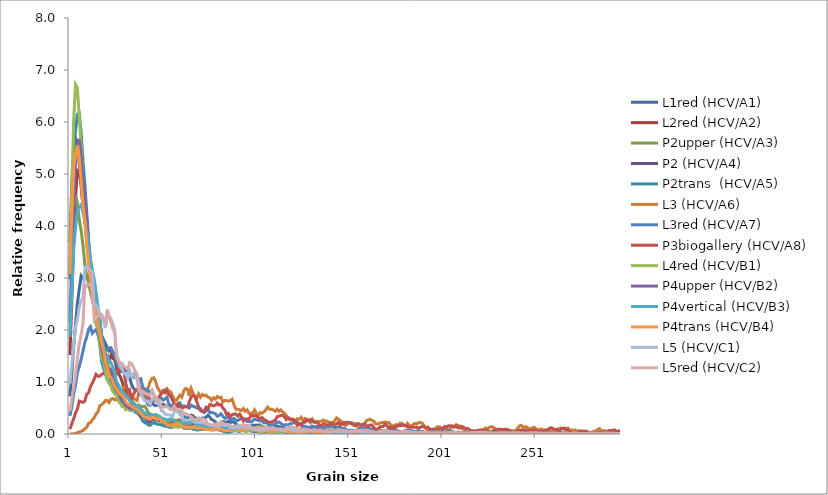
| Category | L1red (HCV/A1)  | L2red (HCV/A2)  | P2upper (HCV/A3) | P2 (HCV/A4) | P2trans  (HCV/A5) | L3 (HCV/A6) | L3red (HCV/A7) | P3biogallery (HCV/A8) | L4red (HCV/B1) | P4upper (HCV/B2) | P4vertical (HCV/B3) | P4trans (HCV/B4) | L5 (HCV/C1) | L5red (HCV/C2) |
|---|---|---|---|---|---|---|---|---|---|---|---|---|---|---|
| 0 | 0.723 | 1.518 | 3.161 | 3.675 | 2.975 | 0 | 0.349 | 0.092 | 3.28 | 2.144 | 1.867 | 3.077 | 0.969 | 0.437 |
| 1 | 1.149 | 2.56 | 3.905 | 4.815 | 4.295 | 0 | 0.524 | 0.198 | 4.693 | 3.442 | 2.732 | 4.204 | 1.339 | 0.682 |
| 2 | 1.673 | 3.662 | 4.352 | 5.426 | 5.286 | 0 | 0.77 | 0.29 | 6.027 | 4.434 | 3.531 | 5.092 | 1.691 | 0.905 |
| 3 | 2.107 | 4.538 | 4.59 | 5.691 | 5.826 | 0.013 | 0.936 | 0.409 | 6.72 | 5.186 | 3.966 | 5.383 | 2.053 | 1.142 |
| 4 | 2.509 | 5.067 | 4.416 | 5.624 | 6.153 | 0.026 | 1.182 | 0.475 | 6.652 | 5.572 | 4.315 | 5.553 | 2.214 | 1.448 |
| 5 | 2.785 | 5.041 | 4.12 | 5.19 | 6.171 | 0.039 | 1.293 | 0.634 | 6.099 | 5.671 | 4.366 | 5.298 | 2.441 | 1.725 |
| 6 | 3.041 | 4.807 | 3.916 | 4.786 | 5.804 | 0.052 | 1.436 | 0.62 | 5.521 | 5.288 | 4.408 | 4.871 | 2.563 | 1.906 |
| 7 | 2.996 | 4.36 | 3.626 | 4.399 | 5.264 | 0.064 | 1.595 | 0.607 | 4.833 | 4.902 | 4.257 | 4.388 | 2.605 | 2.118 |
| 8 | 3.021 | 4.143 | 3.26 | 4.102 | 4.803 | 0.103 | 1.761 | 0.634 | 4.228 | 4.533 | 4.098 | 4.101 | 3.16 | 2.863 |
| 9 | 3.045 | 3.761 | 3.051 | 3.719 | 4.27 | 0.129 | 1.864 | 0.766 | 3.682 | 4.146 | 3.9 | 3.629 | 3.233 | 2.839 |
| 10 | 3.029 | 3.523 | 2.899 | 3.347 | 3.722 | 0.206 | 2.015 | 0.792 | 3.304 | 3.709 | 3.686 | 3.283 | 3.188 | 2.873 |
| 11 | 2.826 | 3.271 | 2.737 | 3.049 | 3.174 | 0.219 | 2.063 | 0.911 | 3.014 | 3.36 | 3.333 | 2.973 | 3.154 | 2.873 |
| 12 | 2.834 | 3.106 | 2.58 | 2.759 | 2.942 | 0.27 | 1.936 | 0.977 | 2.731 | 3.11 | 3.166 | 2.697 | 3.123 | 2.79 |
| 13 | 2.696 | 2.807 | 2.446 | 2.472 | 2.536 | 0.309 | 1.975 | 1.056 | 2.373 | 2.73 | 2.976 | 2.428 | 2.495 | 2.199 |
| 14 | 2.542 | 2.581 | 2.173 | 2.266 | 2.264 | 0.386 | 2.007 | 1.149 | 2.106 | 2.405 | 2.728 | 2.358 | 2.49 | 2.248 |
| 15 | 2.322 | 2.343 | 2.034 | 2.078 | 1.923 | 0.425 | 1.912 | 1.109 | 2.034 | 2.144 | 2.449 | 2.108 | 2.409 | 2.264 |
| 16 | 2.201 | 2.169 | 1.842 | 1.883 | 1.72 | 0.541 | 1.888 | 1.109 | 1.744 | 1.907 | 2.227 | 1.968 | 2.308 | 2.285 |
| 17 | 1.896 | 1.861 | 1.807 | 1.641 | 1.397 | 0.567 | 1.848 | 1.149 | 1.469 | 1.653 | 1.816 | 1.743 | 2.222 | 2.298 |
| 18 | 1.815 | 1.709 | 1.621 | 1.53 | 1.266 | 0.592 | 1.722 | 1.162 | 1.385 | 1.477 | 1.672 | 1.618 | 2.18 | 2.22 |
| 19 | 1.738 | 1.514 | 1.54 | 1.398 | 1.154 | 0.644 | 1.595 | 1.175 | 1.218 | 1.355 | 1.513 | 1.385 | 2.037 | 2.144 |
| 20 | 1.669 | 1.51 | 1.371 | 1.254 | 1.045 | 0.644 | 1.626 | 1.254 | 1.039 | 1.247 | 1.517 | 1.286 | 2.279 | 2.392 |
| 21 | 1.6 | 1.414 | 1.232 | 1.118 | 1.038 | 0.605 | 1.65 | 1.267 | 0.971 | 1.186 | 1.37 | 1.124 | 2.269 | 2.254 |
| 22 | 1.64 | 1.514 | 1.063 | 1.104 | 1.019 | 0.67 | 1.658 | 1.215 | 0.916 | 1.22 | 1.378 | 1.087 | 2.214 | 2.152 |
| 23 | 1.531 | 1.453 | 0.906 | 0.986 | 0.929 | 0.683 | 1.579 | 1.215 | 0.82 | 1.121 | 1.273 | 0.999 | 2.12 | 2.024 |
| 24 | 1.413 | 1.462 | 0.837 | 0.905 | 0.838 | 0.657 | 1.515 | 1.096 | 0.772 | 1.06 | 1.18 | 0.914 | 1.995 | 1.948 |
| 25 | 1.368 | 1.241 | 0.877 | 0.831 | 0.78 | 0.657 | 1.388 | 1.175 | 0.732 | 0.942 | 1.001 | 0.862 | 1.534 | 1.472 |
| 26 | 1.267 | 1.163 | 0.86 | 0.769 | 0.653 | 0.773 | 1.285 | 1.241 | 0.637 | 0.81 | 0.947 | 0.807 | 1.417 | 1.404 |
| 27 | 1.198 | 1.102 | 0.773 | 0.662 | 0.664 | 0.786 | 1.301 | 1.228 | 0.585 | 0.701 | 0.873 | 0.759 | 1.292 | 1.37 |
| 28 | 1.202 | 1.007 | 0.813 | 0.644 | 0.624 | 0.824 | 1.261 | 1.254 | 0.525 | 0.654 | 0.803 | 0.737 | 1.248 | 1.357 |
| 29 | 1.194 | 0.863 | 0.796 | 0.585 | 0.591 | 0.901 | 1.269 | 1.188 | 0.529 | 0.606 | 0.764 | 0.7 | 1.162 | 1.299 |
| 30 | 1.121 | 0.82 | 0.732 | 0.555 | 0.57 | 0.94 | 1.222 | 0.964 | 0.466 | 0.539 | 0.737 | 0.612 | 1.151 | 1.281 |
| 31 | 1.133 | 0.759 | 0.709 | 0.555 | 0.537 | 0.85 | 1.222 | 0.805 | 0.494 | 0.532 | 0.687 | 0.578 | 1.076 | 1.242 |
| 32 | 1.104 | 0.651 | 0.674 | 0.544 | 0.461 | 0.747 | 1.158 | 0.845 | 0.462 | 0.495 | 0.652 | 0.553 | 1.227 | 1.373 |
| 33 | 0.954 | 0.599 | 0.645 | 0.489 | 0.45 | 0.734 | 1.127 | 0.673 | 0.474 | 0.484 | 0.613 | 0.531 | 1.115 | 1.357 |
| 34 | 0.885 | 0.573 | 0.61 | 0.489 | 0.468 | 0.683 | 1.095 | 0.752 | 0.458 | 0.488 | 0.582 | 0.505 | 1.149 | 1.286 |
| 35 | 0.836 | 0.564 | 0.552 | 0.456 | 0.421 | 0.67 | 1.182 | 0.832 | 0.47 | 0.484 | 0.536 | 0.497 | 1.097 | 1.208 |
| 36 | 0.853 | 0.486 | 0.511 | 0.412 | 0.406 | 0.644 | 1.103 | 0.858 | 0.438 | 0.457 | 0.524 | 0.475 | 1.039 | 1.15 |
| 37 | 0.857 | 0.46 | 0.558 | 0.375 | 0.403 | 0.798 | 1.047 | 0.792 | 0.422 | 0.444 | 0.528 | 0.45 | 0.823 | 0.912 |
| 38 | 0.853 | 0.43 | 0.529 | 0.327 | 0.374 | 0.76 | 1.063 | 0.871 | 0.378 | 0.393 | 0.489 | 0.405 | 0.794 | 0.831 |
| 39 | 0.739 | 0.416 | 0.529 | 0.257 | 0.261 | 0.734 | 0.904 | 0.792 | 0.338 | 0.325 | 0.438 | 0.357 | 0.706 | 0.803 |
| 40 | 0.743 | 0.382 | 0.535 | 0.261 | 0.221 | 0.708 | 0.865 | 0.752 | 0.299 | 0.322 | 0.407 | 0.328 | 0.643 | 0.784 |
| 41 | 0.641 | 0.377 | 0.488 | 0.239 | 0.207 | 0.85 | 0.857 | 0.766 | 0.291 | 0.274 | 0.384 | 0.31 | 0.636 | 0.766 |
| 42 | 0.564 | 0.36 | 0.413 | 0.224 | 0.174 | 0.889 | 0.841 | 0.713 | 0.287 | 0.271 | 0.357 | 0.31 | 0.61 | 0.748 |
| 43 | 0.548 | 0.36 | 0.383 | 0.239 | 0.167 | 1.005 | 0.777 | 0.66 | 0.311 | 0.278 | 0.349 | 0.284 | 0.568 | 0.745 |
| 44 | 0.601 | 0.351 | 0.36 | 0.283 | 0.203 | 1.069 | 0.833 | 0.673 | 0.318 | 0.308 | 0.373 | 0.317 | 0.682 | 0.824 |
| 45 | 0.56 | 0.343 | 0.314 | 0.272 | 0.218 | 1.082 | 0.754 | 0.634 | 0.295 | 0.281 | 0.361 | 0.317 | 0.675 | 0.763 |
| 46 | 0.544 | 0.351 | 0.343 | 0.257 | 0.2 | 1.005 | 0.674 | 0.647 | 0.275 | 0.301 | 0.376 | 0.306 | 0.651 | 0.701 |
| 47 | 0.56 | 0.343 | 0.331 | 0.261 | 0.189 | 0.889 | 0.595 | 0.686 | 0.263 | 0.291 | 0.357 | 0.287 | 0.583 | 0.677 |
| 48 | 0.552 | 0.321 | 0.337 | 0.239 | 0.181 | 0.837 | 0.706 | 0.726 | 0.231 | 0.257 | 0.341 | 0.298 | 0.586 | 0.635 |
| 49 | 0.568 | 0.295 | 0.279 | 0.202 | 0.174 | 0.773 | 0.69 | 0.779 | 0.227 | 0.257 | 0.307 | 0.262 | 0.445 | 0.515 |
| 50 | 0.572 | 0.295 | 0.273 | 0.18 | 0.163 | 0.824 | 0.651 | 0.832 | 0.231 | 0.247 | 0.295 | 0.239 | 0.438 | 0.512 |
| 51 | 0.544 | 0.26 | 0.256 | 0.18 | 0.145 | 0.85 | 0.674 | 0.792 | 0.199 | 0.2 | 0.279 | 0.221 | 0.383 | 0.528 |
| 52 | 0.532 | 0.239 | 0.256 | 0.18 | 0.156 | 0.876 | 0.706 | 0.832 | 0.187 | 0.183 | 0.276 | 0.181 | 0.375 | 0.523 |
| 53 | 0.532 | 0.243 | 0.232 | 0.166 | 0.134 | 0.824 | 0.587 | 0.752 | 0.187 | 0.183 | 0.276 | 0.169 | 0.367 | 0.507 |
| 54 | 0.512 | 0.239 | 0.256 | 0.184 | 0.123 | 0.811 | 0.532 | 0.726 | 0.151 | 0.166 | 0.291 | 0.173 | 0.365 | 0.465 |
| 55 | 0.483 | 0.217 | 0.279 | 0.177 | 0.131 | 0.734 | 0.555 | 0.647 | 0.147 | 0.18 | 0.283 | 0.188 | 0.336 | 0.484 |
| 56 | 0.483 | 0.23 | 0.267 | 0.166 | 0.16 | 0.657 | 0.547 | 0.581 | 0.135 | 0.183 | 0.248 | 0.177 | 0.432 | 0.536 |
| 57 | 0.52 | 0.239 | 0.25 | 0.18 | 0.163 | 0.644 | 0.563 | 0.528 | 0.143 | 0.21 | 0.21 | 0.206 | 0.438 | 0.476 |
| 58 | 0.475 | 0.247 | 0.273 | 0.191 | 0.171 | 0.695 | 0.555 | 0.581 | 0.123 | 0.207 | 0.21 | 0.192 | 0.422 | 0.471 |
| 59 | 0.382 | 0.243 | 0.273 | 0.158 | 0.174 | 0.747 | 0.595 | 0.515 | 0.159 | 0.176 | 0.221 | 0.181 | 0.38 | 0.473 |
| 60 | 0.349 | 0.221 | 0.227 | 0.14 | 0.145 | 0.708 | 0.524 | 0.488 | 0.155 | 0.156 | 0.206 | 0.147 | 0.352 | 0.455 |
| 61 | 0.357 | 0.226 | 0.209 | 0.151 | 0.116 | 0.824 | 0.539 | 0.515 | 0.155 | 0.156 | 0.202 | 0.144 | 0.263 | 0.376 |
| 62 | 0.3 | 0.23 | 0.215 | 0.11 | 0.105 | 0.876 | 0.532 | 0.528 | 0.135 | 0.132 | 0.217 | 0.118 | 0.274 | 0.4 |
| 63 | 0.305 | 0.182 | 0.174 | 0.118 | 0.123 | 0.863 | 0.524 | 0.515 | 0.151 | 0.136 | 0.233 | 0.133 | 0.266 | 0.371 |
| 64 | 0.341 | 0.178 | 0.186 | 0.125 | 0.105 | 0.734 | 0.5 | 0.62 | 0.119 | 0.149 | 0.221 | 0.125 | 0.274 | 0.363 |
| 65 | 0.365 | 0.2 | 0.209 | 0.121 | 0.109 | 0.876 | 0.555 | 0.713 | 0.123 | 0.156 | 0.217 | 0.129 | 0.284 | 0.335 |
| 66 | 0.349 | 0.182 | 0.232 | 0.096 | 0.112 | 0.786 | 0.532 | 0.739 | 0.123 | 0.156 | 0.233 | 0.14 | 0.258 | 0.293 |
| 67 | 0.309 | 0.161 | 0.238 | 0.107 | 0.094 | 0.721 | 0.524 | 0.726 | 0.135 | 0.156 | 0.217 | 0.136 | 0.237 | 0.269 |
| 68 | 0.3 | 0.169 | 0.227 | 0.096 | 0.076 | 0.683 | 0.5 | 0.62 | 0.127 | 0.166 | 0.167 | 0.111 | 0.221 | 0.277 |
| 69 | 0.288 | 0.174 | 0.227 | 0.085 | 0.08 | 0.773 | 0.484 | 0.528 | 0.131 | 0.169 | 0.155 | 0.114 | 0.229 | 0.311 |
| 70 | 0.276 | 0.169 | 0.192 | 0.085 | 0.102 | 0.708 | 0.484 | 0.449 | 0.111 | 0.186 | 0.163 | 0.122 | 0.214 | 0.282 |
| 71 | 0.309 | 0.156 | 0.163 | 0.088 | 0.098 | 0.76 | 0.436 | 0.436 | 0.119 | 0.173 | 0.14 | 0.099 | 0.221 | 0.293 |
| 72 | 0.309 | 0.169 | 0.139 | 0.092 | 0.116 | 0.734 | 0.413 | 0.436 | 0.096 | 0.152 | 0.14 | 0.099 | 0.198 | 0.282 |
| 73 | 0.321 | 0.169 | 0.151 | 0.092 | 0.116 | 0.747 | 0.444 | 0.515 | 0.104 | 0.125 | 0.144 | 0.085 | 0.201 | 0.254 |
| 74 | 0.361 | 0.178 | 0.122 | 0.099 | 0.116 | 0.708 | 0.484 | 0.488 | 0.1 | 0.119 | 0.12 | 0.092 | 0.18 | 0.193 |
| 75 | 0.329 | 0.169 | 0.128 | 0.11 | 0.112 | 0.695 | 0.413 | 0.568 | 0.104 | 0.085 | 0.12 | 0.081 | 0.172 | 0.186 |
| 76 | 0.276 | 0.161 | 0.105 | 0.118 | 0.112 | 0.644 | 0.413 | 0.554 | 0.104 | 0.081 | 0.12 | 0.085 | 0.156 | 0.167 |
| 77 | 0.264 | 0.139 | 0.116 | 0.103 | 0.105 | 0.695 | 0.405 | 0.541 | 0.107 | 0.081 | 0.128 | 0.074 | 0.159 | 0.183 |
| 78 | 0.231 | 0.139 | 0.139 | 0.107 | 0.102 | 0.67 | 0.389 | 0.554 | 0.096 | 0.085 | 0.147 | 0.099 | 0.148 | 0.186 |
| 79 | 0.191 | 0.134 | 0.145 | 0.099 | 0.098 | 0.721 | 0.341 | 0.594 | 0.096 | 0.088 | 0.159 | 0.088 | 0.146 | 0.199 |
| 80 | 0.195 | 0.113 | 0.139 | 0.088 | 0.083 | 0.695 | 0.357 | 0.554 | 0.084 | 0.078 | 0.151 | 0.092 | 0.146 | 0.199 |
| 81 | 0.231 | 0.1 | 0.192 | 0.066 | 0.08 | 0.708 | 0.389 | 0.568 | 0.076 | 0.088 | 0.159 | 0.092 | 0.185 | 0.235 |
| 82 | 0.235 | 0.1 | 0.174 | 0.063 | 0.062 | 0.618 | 0.341 | 0.502 | 0.08 | 0.085 | 0.144 | 0.081 | 0.175 | 0.207 |
| 83 | 0.231 | 0.1 | 0.145 | 0.051 | 0.044 | 0.644 | 0.301 | 0.462 | 0.08 | 0.091 | 0.116 | 0.07 | 0.164 | 0.193 |
| 84 | 0.223 | 0.074 | 0.157 | 0.051 | 0.036 | 0.644 | 0.309 | 0.37 | 0.064 | 0.088 | 0.105 | 0.066 | 0.169 | 0.178 |
| 85 | 0.244 | 0.069 | 0.163 | 0.055 | 0.029 | 0.631 | 0.325 | 0.396 | 0.068 | 0.102 | 0.097 | 0.077 | 0.175 | 0.165 |
| 86 | 0.219 | 0.078 | 0.151 | 0.066 | 0.04 | 0.644 | 0.27 | 0.33 | 0.06 | 0.095 | 0.089 | 0.074 | 0.125 | 0.136 |
| 87 | 0.235 | 0.074 | 0.145 | 0.066 | 0.054 | 0.67 | 0.286 | 0.37 | 0.064 | 0.102 | 0.089 | 0.111 | 0.125 | 0.144 |
| 88 | 0.227 | 0.069 | 0.134 | 0.063 | 0.069 | 0.554 | 0.301 | 0.383 | 0.06 | 0.102 | 0.097 | 0.103 | 0.122 | 0.146 |
| 89 | 0.195 | 0.091 | 0.128 | 0.066 | 0.065 | 0.476 | 0.262 | 0.383 | 0.068 | 0.105 | 0.101 | 0.099 | 0.125 | 0.144 |
| 90 | 0.171 | 0.1 | 0.128 | 0.055 | 0.08 | 0.476 | 0.262 | 0.343 | 0.068 | 0.105 | 0.105 | 0.092 | 0.122 | 0.165 |
| 91 | 0.146 | 0.113 | 0.105 | 0.055 | 0.062 | 0.464 | 0.278 | 0.383 | 0.064 | 0.115 | 0.105 | 0.103 | 0.128 | 0.152 |
| 92 | 0.122 | 0.108 | 0.105 | 0.066 | 0.069 | 0.451 | 0.309 | 0.33 | 0.06 | 0.115 | 0.113 | 0.085 | 0.128 | 0.159 |
| 93 | 0.134 | 0.108 | 0.11 | 0.074 | 0.065 | 0.489 | 0.286 | 0.251 | 0.064 | 0.108 | 0.113 | 0.085 | 0.146 | 0.183 |
| 94 | 0.166 | 0.104 | 0.105 | 0.055 | 0.076 | 0.438 | 0.286 | 0.29 | 0.048 | 0.102 | 0.101 | 0.096 | 0.12 | 0.167 |
| 95 | 0.154 | 0.091 | 0.087 | 0.07 | 0.065 | 0.464 | 0.238 | 0.29 | 0.048 | 0.098 | 0.093 | 0.092 | 0.115 | 0.152 |
| 96 | 0.146 | 0.074 | 0.081 | 0.07 | 0.073 | 0.399 | 0.238 | 0.277 | 0.064 | 0.091 | 0.089 | 0.099 | 0.117 | 0.159 |
| 97 | 0.15 | 0.065 | 0.093 | 0.07 | 0.062 | 0.399 | 0.23 | 0.356 | 0.06 | 0.085 | 0.089 | 0.099 | 0.109 | 0.139 |
| 98 | 0.171 | 0.056 | 0.11 | 0.055 | 0.062 | 0.399 | 0.254 | 0.343 | 0.072 | 0.098 | 0.078 | 0.099 | 0.094 | 0.112 |
| 99 | 0.166 | 0.052 | 0.105 | 0.059 | 0.054 | 0.464 | 0.286 | 0.356 | 0.08 | 0.115 | 0.081 | 0.085 | 0.091 | 0.107 |
| 100 | 0.166 | 0.056 | 0.128 | 0.048 | 0.054 | 0.399 | 0.27 | 0.343 | 0.068 | 0.115 | 0.089 | 0.074 | 0.096 | 0.123 |
| 101 | 0.175 | 0.061 | 0.151 | 0.044 | 0.058 | 0.348 | 0.262 | 0.317 | 0.052 | 0.112 | 0.089 | 0.066 | 0.081 | 0.12 |
| 102 | 0.171 | 0.074 | 0.145 | 0.037 | 0.065 | 0.412 | 0.254 | 0.29 | 0.044 | 0.098 | 0.085 | 0.063 | 0.07 | 0.123 |
| 103 | 0.138 | 0.078 | 0.139 | 0.048 | 0.054 | 0.399 | 0.246 | 0.317 | 0.028 | 0.075 | 0.089 | 0.059 | 0.078 | 0.105 |
| 104 | 0.118 | 0.087 | 0.139 | 0.051 | 0.062 | 0.425 | 0.214 | 0.277 | 0.028 | 0.061 | 0.093 | 0.063 | 0.076 | 0.12 |
| 105 | 0.118 | 0.108 | 0.116 | 0.051 | 0.073 | 0.464 | 0.222 | 0.264 | 0.032 | 0.054 | 0.093 | 0.066 | 0.076 | 0.133 |
| 106 | 0.11 | 0.113 | 0.099 | 0.051 | 0.065 | 0.515 | 0.198 | 0.238 | 0.04 | 0.054 | 0.097 | 0.059 | 0.091 | 0.12 |
| 107 | 0.11 | 0.113 | 0.093 | 0.048 | 0.073 | 0.476 | 0.167 | 0.224 | 0.036 | 0.071 | 0.101 | 0.048 | 0.104 | 0.112 |
| 108 | 0.11 | 0.121 | 0.099 | 0.055 | 0.08 | 0.476 | 0.159 | 0.224 | 0.028 | 0.071 | 0.101 | 0.055 | 0.096 | 0.123 |
| 109 | 0.122 | 0.1 | 0.093 | 0.055 | 0.073 | 0.464 | 0.182 | 0.251 | 0.02 | 0.058 | 0.101 | 0.059 | 0.107 | 0.125 |
| 110 | 0.154 | 0.074 | 0.087 | 0.055 | 0.058 | 0.438 | 0.19 | 0.251 | 0.02 | 0.068 | 0.093 | 0.074 | 0.094 | 0.089 |
| 111 | 0.154 | 0.069 | 0.081 | 0.048 | 0.058 | 0.476 | 0.222 | 0.33 | 0.02 | 0.071 | 0.078 | 0.074 | 0.096 | 0.078 |
| 112 | 0.138 | 0.082 | 0.087 | 0.051 | 0.044 | 0.438 | 0.23 | 0.343 | 0.028 | 0.078 | 0.066 | 0.085 | 0.094 | 0.081 |
| 113 | 0.134 | 0.065 | 0.064 | 0.044 | 0.047 | 0.464 | 0.206 | 0.356 | 0.048 | 0.075 | 0.058 | 0.074 | 0.096 | 0.078 |
| 114 | 0.126 | 0.074 | 0.052 | 0.04 | 0.051 | 0.425 | 0.182 | 0.356 | 0.052 | 0.078 | 0.047 | 0.059 | 0.094 | 0.068 |
| 115 | 0.102 | 0.078 | 0.052 | 0.04 | 0.051 | 0.399 | 0.167 | 0.33 | 0.052 | 0.075 | 0.043 | 0.055 | 0.086 | 0.068 |
| 116 | 0.089 | 0.069 | 0.052 | 0.04 | 0.044 | 0.361 | 0.182 | 0.277 | 0.048 | 0.068 | 0.039 | 0.048 | 0.083 | 0.086 |
| 117 | 0.106 | 0.069 | 0.041 | 0.033 | 0.04 | 0.296 | 0.167 | 0.317 | 0.052 | 0.051 | 0.047 | 0.044 | 0.102 | 0.131 |
| 118 | 0.114 | 0.069 | 0.046 | 0.033 | 0.047 | 0.27 | 0.198 | 0.29 | 0.032 | 0.051 | 0.05 | 0.048 | 0.086 | 0.131 |
| 119 | 0.093 | 0.056 | 0.046 | 0.044 | 0.051 | 0.27 | 0.198 | 0.29 | 0.036 | 0.054 | 0.058 | 0.048 | 0.073 | 0.125 |
| 120 | 0.081 | 0.069 | 0.046 | 0.048 | 0.058 | 0.283 | 0.23 | 0.264 | 0.036 | 0.054 | 0.085 | 0.033 | 0.07 | 0.128 |
| 121 | 0.081 | 0.069 | 0.046 | 0.051 | 0.062 | 0.232 | 0.206 | 0.251 | 0.028 | 0.044 | 0.089 | 0.044 | 0.073 | 0.12 |
| 122 | 0.077 | 0.052 | 0.052 | 0.048 | 0.065 | 0.296 | 0.222 | 0.158 | 0.024 | 0.051 | 0.089 | 0.037 | 0.049 | 0.086 |
| 123 | 0.085 | 0.048 | 0.058 | 0.059 | 0.058 | 0.283 | 0.198 | 0.198 | 0.028 | 0.061 | 0.081 | 0.029 | 0.057 | 0.086 |
| 124 | 0.106 | 0.052 | 0.07 | 0.048 | 0.054 | 0.322 | 0.198 | 0.172 | 0.032 | 0.054 | 0.085 | 0.033 | 0.057 | 0.092 |
| 125 | 0.093 | 0.035 | 0.076 | 0.037 | 0.054 | 0.258 | 0.151 | 0.224 | 0.04 | 0.044 | 0.058 | 0.037 | 0.073 | 0.097 |
| 126 | 0.122 | 0.035 | 0.076 | 0.037 | 0.051 | 0.296 | 0.151 | 0.224 | 0.044 | 0.041 | 0.058 | 0.033 | 0.057 | 0.094 |
| 127 | 0.106 | 0.026 | 0.07 | 0.044 | 0.04 | 0.258 | 0.135 | 0.277 | 0.04 | 0.041 | 0.062 | 0.037 | 0.065 | 0.078 |
| 128 | 0.085 | 0.035 | 0.058 | 0.026 | 0.029 | 0.27 | 0.127 | 0.251 | 0.04 | 0.03 | 0.07 | 0.055 | 0.057 | 0.081 |
| 129 | 0.093 | 0.026 | 0.052 | 0.037 | 0.025 | 0.219 | 0.135 | 0.277 | 0.032 | 0.03 | 0.058 | 0.048 | 0.06 | 0.068 |
| 130 | 0.102 | 0.03 | 0.046 | 0.051 | 0.015 | 0.283 | 0.151 | 0.251 | 0.028 | 0.034 | 0.062 | 0.052 | 0.06 | 0.076 |
| 131 | 0.077 | 0.03 | 0.046 | 0.051 | 0.022 | 0.232 | 0.135 | 0.224 | 0.036 | 0.041 | 0.062 | 0.044 | 0.073 | 0.081 |
| 132 | 0.102 | 0.026 | 0.046 | 0.048 | 0.033 | 0.245 | 0.143 | 0.224 | 0.048 | 0.037 | 0.047 | 0.037 | 0.063 | 0.078 |
| 133 | 0.118 | 0.022 | 0.035 | 0.051 | 0.036 | 0.232 | 0.143 | 0.211 | 0.06 | 0.034 | 0.05 | 0.026 | 0.068 | 0.065 |
| 134 | 0.102 | 0.03 | 0.041 | 0.04 | 0.04 | 0.245 | 0.127 | 0.158 | 0.06 | 0.044 | 0.05 | 0.033 | 0.081 | 0.073 |
| 135 | 0.093 | 0.026 | 0.058 | 0.029 | 0.04 | 0.245 | 0.127 | 0.172 | 0.052 | 0.047 | 0.054 | 0.026 | 0.063 | 0.06 |
| 136 | 0.089 | 0.03 | 0.052 | 0.033 | 0.04 | 0.27 | 0.127 | 0.198 | 0.044 | 0.058 | 0.047 | 0.022 | 0.042 | 0.055 |
| 137 | 0.065 | 0.048 | 0.064 | 0.033 | 0.033 | 0.245 | 0.135 | 0.185 | 0.032 | 0.054 | 0.054 | 0.026 | 0.044 | 0.055 |
| 138 | 0.037 | 0.052 | 0.076 | 0.033 | 0.033 | 0.245 | 0.135 | 0.172 | 0.016 | 0.061 | 0.05 | 0.037 | 0.042 | 0.065 |
| 139 | 0.032 | 0.052 | 0.07 | 0.029 | 0.025 | 0.219 | 0.135 | 0.172 | 0.02 | 0.044 | 0.05 | 0.033 | 0.031 | 0.055 |
| 140 | 0.028 | 0.056 | 0.052 | 0.029 | 0.029 | 0.219 | 0.135 | 0.211 | 0.02 | 0.037 | 0.047 | 0.044 | 0.034 | 0.05 |
| 141 | 0.037 | 0.061 | 0.046 | 0.029 | 0.025 | 0.219 | 0.143 | 0.185 | 0.024 | 0.027 | 0.047 | 0.044 | 0.042 | 0.044 |
| 142 | 0.045 | 0.043 | 0.035 | 0.029 | 0.025 | 0.258 | 0.119 | 0.185 | 0.036 | 0.034 | 0.054 | 0.055 | 0.044 | 0.055 |
| 143 | 0.065 | 0.043 | 0.029 | 0.033 | 0.029 | 0.309 | 0.135 | 0.198 | 0.032 | 0.027 | 0.047 | 0.044 | 0.039 | 0.052 |
| 144 | 0.069 | 0.048 | 0.029 | 0.044 | 0.033 | 0.283 | 0.135 | 0.224 | 0.028 | 0.03 | 0.043 | 0.052 | 0.042 | 0.076 |
| 145 | 0.073 | 0.043 | 0.029 | 0.044 | 0.033 | 0.258 | 0.119 | 0.172 | 0.032 | 0.034 | 0.035 | 0.048 | 0.039 | 0.076 |
| 146 | 0.069 | 0.03 | 0.035 | 0.044 | 0.033 | 0.232 | 0.111 | 0.198 | 0.024 | 0.03 | 0.031 | 0.052 | 0.044 | 0.073 |
| 147 | 0.061 | 0.039 | 0.052 | 0.051 | 0.029 | 0.219 | 0.111 | 0.185 | 0.012 | 0.02 | 0.016 | 0.044 | 0.039 | 0.065 |
| 148 | 0.041 | 0.03 | 0.052 | 0.048 | 0.025 | 0.167 | 0.087 | 0.224 | 0.02 | 0.02 | 0.027 | 0.048 | 0.042 | 0.06 |
| 149 | 0.045 | 0.026 | 0.046 | 0.037 | 0.029 | 0.193 | 0.063 | 0.224 | 0.02 | 0.02 | 0.031 | 0.044 | 0.036 | 0.05 |
| 150 | 0.045 | 0.022 | 0.052 | 0.029 | 0.029 | 0.219 | 0.071 | 0.211 | 0.02 | 0.02 | 0.039 | 0.041 | 0.039 | 0.044 |
| 151 | 0.053 | 0.026 | 0.052 | 0.022 | 0.029 | 0.219 | 0.063 | 0.198 | 0.028 | 0.02 | 0.054 | 0.044 | 0.036 | 0.052 |
| 152 | 0.061 | 0.022 | 0.046 | 0.011 | 0.044 | 0.206 | 0.056 | 0.172 | 0.024 | 0.027 | 0.054 | 0.044 | 0.044 | 0.047 |
| 153 | 0.069 | 0.026 | 0.058 | 0.004 | 0.04 | 0.193 | 0.063 | 0.158 | 0.016 | 0.024 | 0.05 | 0.033 | 0.052 | 0.063 |
| 154 | 0.061 | 0.026 | 0.052 | 0.011 | 0.033 | 0.155 | 0.079 | 0.198 | 0.016 | 0.024 | 0.058 | 0.041 | 0.06 | 0.058 |
| 155 | 0.069 | 0.035 | 0.046 | 0.011 | 0.025 | 0.129 | 0.095 | 0.198 | 0.02 | 0.03 | 0.066 | 0.044 | 0.057 | 0.068 |
| 156 | 0.061 | 0.035 | 0.041 | 0.022 | 0.022 | 0.129 | 0.087 | 0.172 | 0.016 | 0.034 | 0.058 | 0.037 | 0.049 | 0.068 |
| 157 | 0.065 | 0.043 | 0.041 | 0.022 | 0.007 | 0.155 | 0.127 | 0.185 | 0.016 | 0.027 | 0.062 | 0.033 | 0.042 | 0.073 |
| 158 | 0.061 | 0.052 | 0.029 | 0.029 | 0.015 | 0.193 | 0.111 | 0.198 | 0.016 | 0.03 | 0.058 | 0.033 | 0.031 | 0.071 |
| 159 | 0.061 | 0.048 | 0.029 | 0.022 | 0.025 | 0.258 | 0.119 | 0.145 | 0.016 | 0.027 | 0.058 | 0.026 | 0.016 | 0.073 |
| 160 | 0.057 | 0.048 | 0.035 | 0.022 | 0.025 | 0.27 | 0.111 | 0.158 | 0.012 | 0.027 | 0.039 | 0.018 | 0.018 | 0.065 |
| 161 | 0.049 | 0.043 | 0.041 | 0.011 | 0.022 | 0.283 | 0.103 | 0.172 | 0.024 | 0.03 | 0.039 | 0.022 | 0.018 | 0.055 |
| 162 | 0.032 | 0.043 | 0.029 | 0.018 | 0.022 | 0.258 | 0.079 | 0.172 | 0.028 | 0.03 | 0.035 | 0.022 | 0.016 | 0.055 |
| 163 | 0.037 | 0.035 | 0.035 | 0.011 | 0.022 | 0.245 | 0.095 | 0.119 | 0.032 | 0.03 | 0.035 | 0.022 | 0.021 | 0.037 |
| 164 | 0.032 | 0.035 | 0.035 | 0.018 | 0.018 | 0.193 | 0.095 | 0.092 | 0.032 | 0.037 | 0.027 | 0.015 | 0.023 | 0.029 |
| 165 | 0.041 | 0.035 | 0.023 | 0.026 | 0.025 | 0.193 | 0.071 | 0.092 | 0.032 | 0.03 | 0.031 | 0.015 | 0.026 | 0.026 |
| 166 | 0.041 | 0.039 | 0.017 | 0.022 | 0.025 | 0.206 | 0.071 | 0.132 | 0.02 | 0.024 | 0.027 | 0.011 | 0.039 | 0.055 |
| 167 | 0.045 | 0.039 | 0.012 | 0.015 | 0.033 | 0.219 | 0.071 | 0.145 | 0.02 | 0.034 | 0.023 | 0.007 | 0.042 | 0.055 |
| 168 | 0.032 | 0.035 | 0.006 | 0.015 | 0.029 | 0.219 | 0.063 | 0.145 | 0.024 | 0.03 | 0.023 | 0.007 | 0.034 | 0.063 |
| 169 | 0.041 | 0.039 | 0.017 | 0.007 | 0.029 | 0.232 | 0.056 | 0.185 | 0.02 | 0.03 | 0.019 | 0.015 | 0.036 | 0.063 |
| 170 | 0.024 | 0.035 | 0.023 | 0.004 | 0.025 | 0.219 | 0.079 | 0.158 | 0.024 | 0.03 | 0.016 | 0.015 | 0.029 | 0.068 |
| 171 | 0.028 | 0.03 | 0.029 | 0.004 | 0.029 | 0.219 | 0.087 | 0.119 | 0.028 | 0.03 | 0.019 | 0.015 | 0.016 | 0.05 |
| 172 | 0.032 | 0.017 | 0.029 | 0.011 | 0.029 | 0.18 | 0.095 | 0.132 | 0.024 | 0.017 | 0.019 | 0.018 | 0.016 | 0.047 |
| 173 | 0.041 | 0.017 | 0.023 | 0.015 | 0.025 | 0.155 | 0.103 | 0.132 | 0.016 | 0.02 | 0.016 | 0.026 | 0.018 | 0.039 |
| 174 | 0.037 | 0.013 | 0.012 | 0.018 | 0.022 | 0.167 | 0.087 | 0.106 | 0.02 | 0.014 | 0.019 | 0.026 | 0.013 | 0.042 |
| 175 | 0.045 | 0.017 | 0.012 | 0.022 | 0.025 | 0.18 | 0.071 | 0.145 | 0.02 | 0.02 | 0.019 | 0.029 | 0.018 | 0.042 |
| 176 | 0.041 | 0.022 | 0.012 | 0.022 | 0.022 | 0.155 | 0.056 | 0.172 | 0.016 | 0.02 | 0.016 | 0.026 | 0.021 | 0.034 |
| 177 | 0.032 | 0.022 | 0.017 | 0.015 | 0.022 | 0.206 | 0.048 | 0.158 | 0.016 | 0.02 | 0.016 | 0.029 | 0.021 | 0.037 |
| 178 | 0.037 | 0.026 | 0.017 | 0.011 | 0.025 | 0.206 | 0.04 | 0.172 | 0.02 | 0.017 | 0.019 | 0.026 | 0.031 | 0.05 |
| 179 | 0.041 | 0.026 | 0.029 | 0.022 | 0.022 | 0.167 | 0.048 | 0.172 | 0.016 | 0.02 | 0.012 | 0.018 | 0.031 | 0.055 |
| 180 | 0.041 | 0.022 | 0.023 | 0.015 | 0.015 | 0.155 | 0.063 | 0.158 | 0.008 | 0.007 | 0.019 | 0.011 | 0.036 | 0.05 |
| 181 | 0.045 | 0.017 | 0.023 | 0.022 | 0.022 | 0.206 | 0.079 | 0.145 | 0.012 | 0.003 | 0.019 | 0.011 | 0.039 | 0.047 |
| 182 | 0.045 | 0.026 | 0.023 | 0.022 | 0.015 | 0.155 | 0.071 | 0.132 | 0.016 | 0.007 | 0.027 | 0.015 | 0.034 | 0.047 |
| 183 | 0.037 | 0.017 | 0.023 | 0.022 | 0.015 | 0.155 | 0.063 | 0.132 | 0.016 | 0.014 | 0.019 | 0.018 | 0.023 | 0.037 |
| 184 | 0.037 | 0.017 | 0.012 | 0.015 | 0.011 | 0.18 | 0.056 | 0.132 | 0.02 | 0.02 | 0.019 | 0.026 | 0.031 | 0.024 |
| 185 | 0.028 | 0.013 | 0.035 | 0.015 | 0.015 | 0.206 | 0.04 | 0.132 | 0.02 | 0.024 | 0.019 | 0.026 | 0.026 | 0.024 |
| 186 | 0.028 | 0.013 | 0.029 | 0.018 | 0.011 | 0.193 | 0.056 | 0.132 | 0.016 | 0.024 | 0.016 | 0.026 | 0.018 | 0.024 |
| 187 | 0.028 | 0.004 | 0.029 | 0.026 | 0.011 | 0.219 | 0.048 | 0.106 | 0.02 | 0.02 | 0.012 | 0.015 | 0.018 | 0.024 |
| 188 | 0.032 | 0.009 | 0.041 | 0.026 | 0.015 | 0.219 | 0.04 | 0.132 | 0.024 | 0.017 | 0.019 | 0.011 | 0.018 | 0.029 |
| 189 | 0.02 | 0.004 | 0.041 | 0.026 | 0.015 | 0.206 | 0.048 | 0.145 | 0.024 | 0.014 | 0.019 | 0.004 | 0.01 | 0.029 |
| 190 | 0.024 | 0.004 | 0.029 | 0.029 | 0.015 | 0.155 | 0.04 | 0.132 | 0.024 | 0.01 | 0.019 | 0.004 | 0.01 | 0.029 |
| 191 | 0.024 | 0.004 | 0.029 | 0.026 | 0.015 | 0.103 | 0.008 | 0.119 | 0.024 | 0.017 | 0.023 | 0.004 | 0.01 | 0.029 |
| 192 | 0.024 | 0.009 | 0.029 | 0.022 | 0.018 | 0.064 | 0.016 | 0.132 | 0.016 | 0.024 | 0.023 | 0.007 | 0.013 | 0.026 |
| 193 | 0.016 | 0.013 | 0.029 | 0.026 | 0.011 | 0.077 | 0.024 | 0.092 | 0.012 | 0.03 | 0.035 | 0.004 | 0.008 | 0.018 |
| 194 | 0.016 | 0.017 | 0.035 | 0.018 | 0.011 | 0.09 | 0.024 | 0.079 | 0.012 | 0.027 | 0.039 | 0.007 | 0.01 | 0.021 |
| 195 | 0.012 | 0.022 | 0.029 | 0.015 | 0.011 | 0.09 | 0.032 | 0.092 | 0.012 | 0.03 | 0.039 | 0.011 | 0.005 | 0.018 |
| 196 | 0.012 | 0.03 | 0.029 | 0.015 | 0.007 | 0.103 | 0.056 | 0.079 | 0.012 | 0.027 | 0.043 | 0.011 | 0.005 | 0.024 |
| 197 | 0.012 | 0.03 | 0.023 | 0.018 | 0.004 | 0.142 | 0.048 | 0.079 | 0.012 | 0.034 | 0.039 | 0.011 | 0.003 | 0.021 |
| 198 | 0.02 | 0.026 | 0.017 | 0.018 | 0.004 | 0.142 | 0.04 | 0.092 | 0.012 | 0.03 | 0.023 | 0.018 | 0.005 | 0.018 |
| 199 | 0.024 | 0.03 | 0.012 | 0.018 | 0.004 | 0.116 | 0.04 | 0.106 | 0.008 | 0.034 | 0.019 | 0.015 | 0.01 | 0.018 |
| 200 | 0.024 | 0.026 | 0.006 | 0.018 | 0 | 0.116 | 0.048 | 0.092 | 0.008 | 0.03 | 0.012 | 0.011 | 0.013 | 0.021 |
| 201 | 0.016 | 0.017 | 0.006 | 0.015 | 0 | 0.103 | 0.032 | 0.145 | 0.004 | 0.027 | 0.004 | 0.018 | 0.016 | 0.016 |
| 202 | 0.012 | 0.017 | 0.006 | 0.007 | 0.007 | 0.103 | 0.048 | 0.132 | 0.008 | 0.024 | 0.008 | 0.022 | 0.016 | 0.013 |
| 203 | 0.004 | 0.013 | 0 | 0.004 | 0.007 | 0.064 | 0.056 | 0.158 | 0.004 | 0.02 | 0.008 | 0.029 | 0.026 | 0.021 |
| 204 | 0.008 | 0.004 | 0 | 0.004 | 0.007 | 0.103 | 0.056 | 0.158 | 0.004 | 0.02 | 0.008 | 0.029 | 0.021 | 0.021 |
| 205 | 0.012 | 0.013 | 0 | 0.007 | 0.011 | 0.142 | 0.048 | 0.158 | 0.008 | 0.02 | 0.019 | 0.033 | 0.023 | 0.026 |
| 206 | 0.02 | 0.013 | 0.006 | 0.004 | 0.011 | 0.142 | 0.04 | 0.132 | 0.008 | 0.027 | 0.027 | 0.029 | 0.026 | 0.026 |
| 207 | 0.024 | 0.013 | 0.006 | 0.011 | 0.004 | 0.142 | 0.024 | 0.172 | 0.004 | 0.017 | 0.023 | 0.029 | 0.026 | 0.024 |
| 208 | 0.028 | 0.017 | 0.006 | 0.015 | 0.007 | 0.167 | 0.04 | 0.119 | 0.008 | 0.017 | 0.023 | 0.018 | 0.016 | 0.018 |
| 209 | 0.02 | 0.017 | 0.017 | 0.015 | 0.007 | 0.155 | 0.032 | 0.119 | 0.008 | 0.014 | 0.031 | 0.022 | 0.016 | 0.016 |
| 210 | 0.016 | 0.009 | 0.017 | 0.015 | 0.011 | 0.103 | 0.024 | 0.145 | 0.008 | 0.014 | 0.027 | 0.022 | 0.013 | 0.005 |
| 211 | 0.012 | 0.013 | 0.017 | 0.018 | 0.011 | 0.103 | 0.032 | 0.132 | 0.012 | 0.014 | 0.019 | 0.018 | 0.008 | 0.008 |
| 212 | 0.012 | 0.009 | 0.017 | 0.018 | 0.015 | 0.064 | 0.032 | 0.106 | 0.012 | 0.014 | 0.023 | 0.011 | 0.013 | 0.01 |
| 213 | 0.008 | 0.004 | 0.035 | 0.018 | 0.011 | 0.039 | 0.016 | 0.106 | 0.016 | 0.01 | 0.023 | 0.007 | 0.016 | 0.016 |
| 214 | 0.012 | 0.009 | 0.023 | 0.022 | 0.018 | 0.013 | 0.024 | 0.092 | 0.016 | 0.01 | 0.016 | 0.007 | 0.013 | 0.016 |
| 215 | 0.012 | 0.013 | 0.029 | 0.022 | 0.011 | 0.013 | 0.056 | 0.053 | 0.02 | 0.01 | 0.008 | 0.015 | 0.013 | 0.024 |
| 216 | 0.008 | 0.013 | 0.023 | 0.022 | 0.015 | 0.013 | 0.048 | 0.066 | 0.024 | 0.003 | 0.008 | 0.022 | 0.013 | 0.024 |
| 217 | 0.008 | 0.013 | 0.029 | 0.018 | 0.011 | 0.026 | 0.048 | 0.053 | 0.028 | 0.003 | 0.012 | 0.029 | 0.008 | 0.024 |
| 218 | 0.016 | 0.013 | 0.012 | 0.015 | 0.011 | 0.026 | 0.04 | 0.066 | 0.02 | 0.007 | 0.012 | 0.033 | 0.005 | 0.018 |
| 219 | 0.012 | 0.009 | 0.012 | 0.011 | 0.004 | 0.064 | 0.048 | 0.066 | 0.02 | 0.007 | 0.016 | 0.029 | 0.01 | 0.034 |
| 220 | 0.016 | 0.009 | 0.006 | 0.007 | 0.004 | 0.064 | 0.04 | 0.079 | 0.012 | 0.007 | 0.016 | 0.022 | 0.01 | 0.034 |
| 221 | 0.016 | 0.004 | 0.035 | 0.011 | 0.004 | 0.077 | 0.04 | 0.066 | 0.004 | 0.01 | 0.016 | 0.018 | 0.013 | 0.031 |
| 222 | 0.012 | 0.004 | 0.035 | 0.011 | 0.004 | 0.09 | 0.04 | 0.066 | 0 | 0.014 | 0.008 | 0.011 | 0.016 | 0.031 |
| 223 | 0.004 | 0.009 | 0.046 | 0.011 | 0.004 | 0.116 | 0.04 | 0.066 | 0 | 0.01 | 0.004 | 0.007 | 0.016 | 0.034 |
| 224 | 0.012 | 0.009 | 0.046 | 0.018 | 0.007 | 0.09 | 0.032 | 0.053 | 0 | 0.007 | 0.004 | 0.015 | 0.016 | 0.026 |
| 225 | 0.008 | 0.004 | 0.046 | 0.018 | 0.007 | 0.129 | 0.008 | 0.026 | 0 | 0.014 | 0.004 | 0.015 | 0.018 | 0.021 |
| 226 | 0.012 | 0.004 | 0.017 | 0.011 | 0.004 | 0.142 | 0.016 | 0.04 | 0.004 | 0.014 | 0.008 | 0.011 | 0.016 | 0.018 |
| 227 | 0.02 | 0.004 | 0.017 | 0.011 | 0.011 | 0.129 | 0.016 | 0.066 | 0.008 | 0.017 | 0.016 | 0.011 | 0.016 | 0.016 |
| 228 | 0.028 | 0.004 | 0.012 | 0.018 | 0.011 | 0.103 | 0.024 | 0.066 | 0.012 | 0.017 | 0.016 | 0.011 | 0.018 | 0.013 |
| 229 | 0.02 | 0.004 | 0.012 | 0.015 | 0.007 | 0.09 | 0.024 | 0.079 | 0.012 | 0.017 | 0.016 | 0.004 | 0.013 | 0.016 |
| 230 | 0.02 | 0.009 | 0.017 | 0.015 | 0.011 | 0.077 | 0.024 | 0.092 | 0.012 | 0.017 | 0.027 | 0.004 | 0.013 | 0.016 |
| 231 | 0.016 | 0.022 | 0.017 | 0.015 | 0.011 | 0.052 | 0.016 | 0.092 | 0.012 | 0.014 | 0.023 | 0.004 | 0.016 | 0.021 |
| 232 | 0.008 | 0.022 | 0.012 | 0.015 | 0.011 | 0.064 | 0.016 | 0.079 | 0.008 | 0.007 | 0.019 | 0.004 | 0.013 | 0.021 |
| 233 | 0 | 0.017 | 0.017 | 0.007 | 0.015 | 0.077 | 0.008 | 0.092 | 0.008 | 0.007 | 0.019 | 0.004 | 0.01 | 0.026 |
| 234 | 0 | 0.017 | 0.017 | 0.004 | 0.015 | 0.077 | 0.008 | 0.092 | 0.012 | 0.01 | 0.023 | 0.004 | 0.01 | 0.018 |
| 235 | 0.004 | 0.017 | 0.012 | 0.004 | 0.011 | 0.064 | 0.008 | 0.079 | 0.012 | 0.003 | 0.019 | 0 | 0.005 | 0.021 |
| 236 | 0.008 | 0.009 | 0.017 | 0.004 | 0.011 | 0.064 | 0.016 | 0.066 | 0.008 | 0.007 | 0.023 | 0.011 | 0.005 | 0.016 |
| 237 | 0.008 | 0.009 | 0.017 | 0 | 0.004 | 0.039 | 0.024 | 0.053 | 0.008 | 0.01 | 0.023 | 0.011 | 0.008 | 0.024 |
| 238 | 0.008 | 0.009 | 0.012 | 0 | 0 | 0.064 | 0.024 | 0.026 | 0.008 | 0.01 | 0.027 | 0.011 | 0.005 | 0.021 |
| 239 | 0.016 | 0.009 | 0.012 | 0 | 0 | 0.064 | 0.032 | 0.026 | 0.004 | 0.007 | 0.019 | 0.015 | 0.008 | 0.024 |
| 240 | 0.012 | 0.004 | 0.017 | 0 | 0 | 0.103 | 0.032 | 0.066 | 0.004 | 0.014 | 0.012 | 0.018 | 0.01 | 0.018 |
| 241 | 0.008 | 0 | 0.017 | 0.004 | 0 | 0.155 | 0.024 | 0.066 | 0.004 | 0.014 | 0.012 | 0.011 | 0.01 | 0.024 |
| 242 | 0.008 | 0 | 0.023 | 0.004 | 0.004 | 0.167 | 0.032 | 0.079 | 0.004 | 0.01 | 0.008 | 0.011 | 0.008 | 0.016 |
| 243 | 0.012 | 0 | 0.023 | 0.007 | 0.004 | 0.129 | 0.032 | 0.079 | 0 | 0.014 | 0.008 | 0.015 | 0.008 | 0.018 |
| 244 | 0.004 | 0 | 0.029 | 0.007 | 0.007 | 0.142 | 0.016 | 0.079 | 0.004 | 0.014 | 0.012 | 0.015 | 0.008 | 0.013 |
| 245 | 0.008 | 0.004 | 0.023 | 0.007 | 0.007 | 0.129 | 0.016 | 0.066 | 0.004 | 0.01 | 0.012 | 0.015 | 0.005 | 0.013 |
| 246 | 0.008 | 0.004 | 0.017 | 0.011 | 0.007 | 0.103 | 0.016 | 0.066 | 0.004 | 0.007 | 0.008 | 0.011 | 0.003 | 0.021 |
| 247 | 0.012 | 0.004 | 0.012 | 0.011 | 0.007 | 0.103 | 0 | 0.066 | 0.004 | 0.007 | 0.008 | 0.011 | 0.003 | 0.026 |
| 248 | 0.012 | 0.004 | 0.006 | 0.007 | 0.007 | 0.116 | 0 | 0.066 | 0.008 | 0.007 | 0.004 | 0.007 | 0.003 | 0.024 |
| 249 | 0.016 | 0.004 | 0.006 | 0.007 | 0.007 | 0.129 | 0.008 | 0.079 | 0.004 | 0.007 | 0 | 0.007 | 0.003 | 0.024 |
| 250 | 0.016 | 0.004 | 0.006 | 0.007 | 0.007 | 0.103 | 0.024 | 0.053 | 0.012 | 0.003 | 0.008 | 0.007 | 0.008 | 0.024 |
| 251 | 0.016 | 0.004 | 0.012 | 0 | 0.007 | 0.077 | 0.024 | 0.053 | 0.012 | 0.003 | 0.012 | 0.011 | 0.013 | 0.016 |
| 252 | 0.012 | 0.004 | 0.029 | 0 | 0.004 | 0.09 | 0.032 | 0.053 | 0.012 | 0.014 | 0.012 | 0.011 | 0.013 | 0.016 |
| 253 | 0.008 | 0.004 | 0.035 | 0.004 | 0.004 | 0.09 | 0.032 | 0.053 | 0.012 | 0.01 | 0.012 | 0.011 | 0.013 | 0.013 |
| 254 | 0.004 | 0.004 | 0.035 | 0.007 | 0 | 0.077 | 0.024 | 0.04 | 0.012 | 0.02 | 0.012 | 0.007 | 0.01 | 0.013 |
| 255 | 0.004 | 0.004 | 0.035 | 0.007 | 0 | 0.064 | 0.016 | 0.079 | 0.004 | 0.02 | 0.008 | 0.004 | 0.005 | 0.018 |
| 256 | 0.004 | 0.009 | 0.029 | 0.011 | 0 | 0.064 | 0.016 | 0.079 | 0.004 | 0.024 | 0.004 | 0 | 0 | 0.016 |
| 257 | 0.008 | 0.009 | 0.012 | 0.011 | 0 | 0.052 | 0.008 | 0.106 | 0.004 | 0.014 | 0.008 | 0 | 0.003 | 0.016 |
| 258 | 0.012 | 0.009 | 0.012 | 0.011 | 0 | 0.052 | 0.008 | 0.119 | 0 | 0.014 | 0.008 | 0.007 | 0.003 | 0.013 |
| 259 | 0.02 | 0.009 | 0.006 | 0.007 | 0 | 0.077 | 0.016 | 0.106 | 0.004 | 0.003 | 0.012 | 0.007 | 0.003 | 0.016 |
| 260 | 0.02 | 0.004 | 0.006 | 0.007 | 0 | 0.077 | 0.008 | 0.079 | 0.004 | 0.003 | 0.008 | 0.011 | 0.005 | 0.016 |
| 261 | 0.024 | 0 | 0.006 | 0.004 | 0.004 | 0.09 | 0.016 | 0.092 | 0.004 | 0 | 0.008 | 0.011 | 0.005 | 0.016 |
| 262 | 0.02 | 0.004 | 0.006 | 0.004 | 0.011 | 0.09 | 0.024 | 0.053 | 0.004 | 0.003 | 0.004 | 0.011 | 0.008 | 0.01 |
| 263 | 0.016 | 0.004 | 0 | 0 | 0.011 | 0.116 | 0.024 | 0.079 | 0.004 | 0.003 | 0.008 | 0.011 | 0.01 | 0.013 |
| 264 | 0.008 | 0.009 | 0.006 | 0.004 | 0.011 | 0.103 | 0.024 | 0.106 | 0 | 0.003 | 0.004 | 0.011 | 0.01 | 0.013 |
| 265 | 0.004 | 0.009 | 0.006 | 0.015 | 0.011 | 0.116 | 0.024 | 0.106 | 0 | 0.003 | 0.004 | 0.007 | 0.01 | 0.008 |
| 266 | 0 | 0.009 | 0.006 | 0.015 | 0.007 | 0.103 | 0.016 | 0.079 | 0 | 0.007 | 0.004 | 0.007 | 0.013 | 0.005 |
| 267 | 0.004 | 0.004 | 0.006 | 0.015 | 0.007 | 0.116 | 0.016 | 0.079 | 0.004 | 0.003 | 0.004 | 0.007 | 0.013 | 0.008 |
| 268 | 0.004 | 0.009 | 0.006 | 0.015 | 0.011 | 0.077 | 0.016 | 0.04 | 0.004 | 0.003 | 0 | 0.004 | 0.01 | 0.008 |
| 269 | 0.004 | 0.004 | 0.006 | 0.015 | 0.011 | 0.077 | 0.008 | 0.013 | 0.004 | 0.003 | 0 | 0.004 | 0.01 | 0.008 |
| 270 | 0.012 | 0.004 | 0.006 | 0.004 | 0.011 | 0.064 | 0.008 | 0 | 0.004 | 0.007 | 0.004 | 0.004 | 0.008 | 0.01 |
| 271 | 0.012 | 0.009 | 0.012 | 0.007 | 0.011 | 0.077 | 0.008 | 0 | 0.004 | 0.003 | 0.008 | 0.004 | 0.005 | 0.013 |
| 272 | 0.012 | 0.009 | 0.012 | 0.015 | 0.004 | 0.052 | 0.008 | 0.013 | 0 | 0.007 | 0.008 | 0.004 | 0.003 | 0.013 |
| 273 | 0.02 | 0.009 | 0.017 | 0.015 | 0 | 0.064 | 0.008 | 0.04 | 0 | 0.014 | 0.008 | 0 | 0.003 | 0.01 |
| 274 | 0.02 | 0.009 | 0.017 | 0.011 | 0 | 0.052 | 0.008 | 0.053 | 0.004 | 0.014 | 0.008 | 0.004 | 0.003 | 0.01 |
| 275 | 0.012 | 0.009 | 0.023 | 0.015 | 0 | 0.052 | 0.008 | 0.053 | 0.004 | 0.01 | 0.004 | 0.004 | 0.003 | 0.01 |
| 276 | 0.016 | 0.004 | 0.017 | 0.011 | 0 | 0.026 | 0.008 | 0.053 | 0.004 | 0.01 | 0 | 0.004 | 0.005 | 0.008 |
| 277 | 0.012 | 0.004 | 0.023 | 0.004 | 0 | 0.026 | 0 | 0.053 | 0.004 | 0.007 | 0 | 0.004 | 0.003 | 0.008 |
| 278 | 0.008 | 0 | 0.017 | 0.004 | 0.007 | 0.013 | 0 | 0.04 | 0.004 | 0 | 0 | 0.004 | 0.003 | 0.016 |
| 279 | 0.008 | 0 | 0.017 | 0.004 | 0.007 | 0 | 0.008 | 0.026 | 0.004 | 0 | 0 | 0 | 0.003 | 0.018 |
| 280 | 0.008 | 0.004 | 0.012 | 0.004 | 0.007 | 0.039 | 0.008 | 0.026 | 0.004 | 0.003 | 0.004 | 0.004 | 0.003 | 0.021 |
| 281 | 0.004 | 0.009 | 0.012 | 0.004 | 0.007 | 0.052 | 0.008 | 0.04 | 0.008 | 0.007 | 0.008 | 0.007 | 0 | 0.021 |
| 282 | 0.004 | 0.009 | 0.006 | 0.004 | 0.007 | 0.052 | 0.008 | 0.026 | 0.008 | 0.01 | 0.008 | 0.007 | 0 | 0.018 |
| 283 | 0.004 | 0.009 | 0.006 | 0.004 | 0.004 | 0.09 | 0.024 | 0.026 | 0.012 | 0.014 | 0.008 | 0.011 | 0 | 0.01 |
| 284 | 0.004 | 0.009 | 0 | 0.004 | 0.004 | 0.103 | 0.024 | 0.026 | 0.012 | 0.014 | 0.008 | 0.011 | 0 | 0.01 |
| 285 | 0.004 | 0.009 | 0 | 0 | 0.004 | 0.064 | 0.024 | 0.026 | 0.016 | 0.01 | 0.004 | 0.007 | 0 | 0.008 |
| 286 | 0.004 | 0.004 | 0.006 | 0.004 | 0.004 | 0.064 | 0.024 | 0.04 | 0.016 | 0.007 | 0.004 | 0.004 | 0.003 | 0.008 |
| 287 | 0.004 | 0.009 | 0.006 | 0.004 | 0.007 | 0.064 | 0.024 | 0.04 | 0.02 | 0.007 | 0.008 | 0.007 | 0.003 | 0.013 |
| 288 | 0 | 0.017 | 0.012 | 0.007 | 0.007 | 0.026 | 0.008 | 0.053 | 0.016 | 0.003 | 0.008 | 0.004 | 0.01 | 0.018 |
| 289 | 0 | 0.017 | 0.012 | 0.011 | 0.007 | 0.013 | 0 | 0.066 | 0.012 | 0.003 | 0.008 | 0.004 | 0.01 | 0.013 |
| 290 | 0 | 0.013 | 0.012 | 0.011 | 0.011 | 0.013 | 0 | 0.066 | 0.008 | 0.007 | 0.008 | 0.004 | 0.013 | 0.01 |
| 291 | 0.008 | 0.013 | 0.006 | 0.007 | 0.011 | 0.013 | 0 | 0.066 | 0.004 | 0.007 | 0.004 | 0.007 | 0.01 | 0.013 |
| 292 | 0.012 | 0.009 | 0.006 | 0.007 | 0.007 | 0.013 | 0.008 | 0.079 | 0 | 0.003 | 0 | 0.004 | 0.01 | 0.01 |
| 293 | 0.012 | 0.004 | 0 | 0.004 | 0.004 | 0.039 | 0.016 | 0.053 | 0 | 0.007 | 0.004 | 0.004 | 0.003 | 0.01 |
| 294 | 0.016 | 0.004 | 0 | 0 | 0.004 | 0.052 | 0.016 | 0.053 | 0 | 0.007 | 0.004 | 0.007 | 0.003 | 0.01 |
| 295 | 0.016 | 0.004 | 0.006 | 0.004 | 0 | 0.052 | 0.016 | 0.066 | 0 | 0.003 | 0.004 | 0.007 | 0.005 | 0.01 |